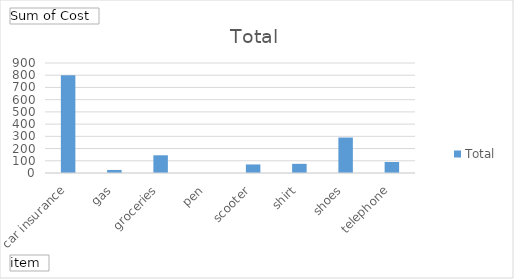
| Category | Total |
|---|---|
| car insurance | 800 |
| gas | 25 |
| groceries | 145 |
| pen | 0 |
| scooter | 70 |
| shirt | 75 |
| shoes | 290 |
| telephone | 90 |